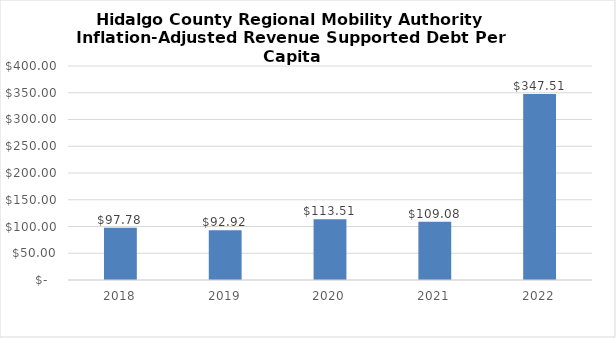
| Category | Series 0 |
|---|---|
| 2018.0 | 97.78 |
| 2019.0 | 92.923 |
| 2020.0 | 113.508 |
| 2021.0 | 109.076 |
| 2022.0 | 347.514 |